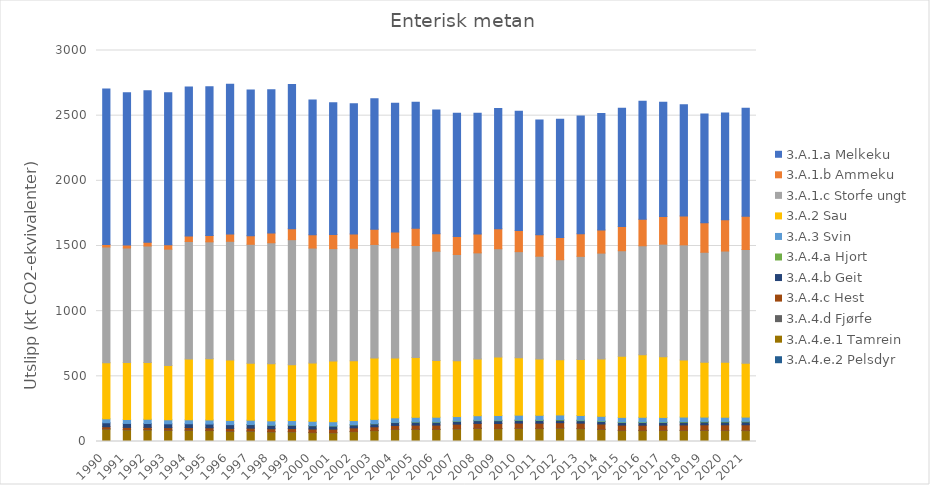
| Category | 3.A.4.e.2 Pelsdyr | 3.A.4.e.1 Tamrein | 3.A.4.d Fjørfe | 3.A.4.c Hest | 3.A.4.b Geit | 3.A.4.a Hjort | 3.A.3 Svin | 3.A.2 Sau | 3.A.1.c Storfe ungt | 3.A.1.b Ammeku | 3.A.1.a Melkeku |
|---|---|---|---|---|---|---|---|---|---|---|---|
| 1990.0 | 0.45 | 95.038 | 1.978 | 15.841 | 30.503 | 0 | 30.082 | 431.003 | 887.637 | 19.729 | 1192.096 |
| 1991.0 | 0.469 | 88.604 | 2.426 | 16.626 | 30.33 | 0 | 30.473 | 437.191 | 878.616 | 22.881 | 1167.5 |
| 1992.0 | 0.361 | 88.409 | 2.4 | 17.31 | 29.822 | 0 | 32.321 | 435.364 | 894.265 | 28.773 | 1163.016 |
| 1993.0 | 0.404 | 85.413 | 2.352 | 18.115 | 29.47 | 0 | 31.041 | 416.771 | 892.356 | 33.322 | 1166.887 |
| 1994.0 | 0.458 | 85.404 | 2.352 | 18.836 | 29.187 | 0 | 30.507 | 465.481 | 902.55 | 41.733 | 1143.943 |
| 1995.0 | 0.466 | 83.235 | 2.304 | 19.159 | 28.651 | 0 | 31.679 | 469.353 | 897.144 | 48.964 | 1140.341 |
| 1996.0 | 0.526 | 78.251 | 2.201 | 19.849 | 28.509 | 0 | 32.794 | 462.471 | 911.447 | 55.832 | 1148.682 |
| 1997.0 | 0.499 | 78.987 | 2.062 | 20.77 | 27.551 | 0.445 | 33.385 | 436.467 | 912.938 | 66.09 | 1117.221 |
| 1998.0 | 0.412 | 73.475 | 2.078 | 22.264 | 26.748 | 0.441 | 33.341 | 438.698 | 927.279 | 74.381 | 1098.84 |
| 1999.0 | 0.361 | 73.683 | 1.995 | 23.437 | 26.096 | 0.974 | 34.179 | 428.637 | 959.207 | 83.909 | 1106.189 |
| 2000.0 | 0.433 | 67.584 | 2.042 | 25.783 | 25.374 | 1.277 | 32.712 | 446.315 | 882.618 | 101.916 | 1033.829 |
| 2001.0 | 0.439 | 65.969 | 1.921 | 26.712 | 24.199 | 1.041 | 31.783 | 465.553 | 862.223 | 109.123 | 1010.891 |
| 2002.0 | 0.432 | 75.2 | 1.989 | 26.828 | 23.308 | 1.523 | 31.246 | 458.675 | 863.272 | 110.361 | 998.071 |
| 2003.0 | 0.421 | 82.349 | 2.042 | 27.881 | 23.101 | 1.357 | 32.521 | 470.878 | 871.366 | 117.335 | 1000.429 |
| 2004.0 | 0.457 | 91.272 | 2.243 | 29.08 | 22.385 | 1.522 | 34.796 | 458.392 | 845.149 | 121.857 | 987.29 |
| 2005.0 | 0.49 | 91.966 | 2.199 | 31.139 | 22.763 | 2.337 | 34.775 | 458.339 | 859.631 | 132.057 | 966.431 |
| 2006.0 | 0.54 | 91.399 | 2.136 | 31.953 | 21.573 | 2.902 | 35.844 | 434.779 | 838.981 | 134.14 | 948.4 |
| 2007.0 | 0.532 | 95.354 | 2.287 | 34.933 | 21.761 | 2.705 | 34.003 | 427.614 | 815.373 | 138.722 | 945.749 |
| 2008.0 | 0.49 | 99.459 | 2.377 | 36.529 | 21.438 | 3.286 | 34.403 | 434.901 | 814.401 | 145.446 | 926.242 |
| 2009.0 | 0.435 | 97.421 | 2.588 | 37.852 | 21.62 | 3.828 | 35.623 | 448.495 | 830.952 | 153.638 | 922.425 |
| 2010.0 | 0.44 | 99.719 | 2.513 | 38.683 | 20.566 | 4.059 | 36.164 | 440.908 | 813.672 | 161.601 | 914.631 |
| 2011.0 | 0.473 | 98.42 | 2.44 | 39.363 | 20.373 | 4.372 | 35.7 | 431.122 | 789.58 | 165.042 | 879.351 |
| 2012.0 | 0.539 | 101.277 | 2.527 | 39.859 | 19.672 | 4.686 | 35.174 | 423.777 | 767.255 | 169.605 | 907.856 |
| 2013.0 | 0.656 | 97.304 | 2.684 | 40.302 | 19.081 | 4.384 | 35.298 | 429.972 | 790.91 | 172.976 | 903.765 |
| 2014.0 | 0.627 | 91.299 | 2.718 | 39.632 | 19.369 | 4.32 | 35.458 | 440.005 | 812.153 | 177.937 | 893.017 |
| 2015.0 | 0.566 | 83.094 | 2.742 | 39.465 | 20.209 | 4.183 | 34.859 | 468.03 | 810.459 | 186.398 | 906.932 |
| 2016.0 | 0.49 | 82.973 | 2.717 | 38.984 | 20.696 | 4.389 | 35.572 | 479.028 | 836.947 | 203.168 | 905.726 |
| 2017.0 | 0.359 | 83.854 | 2.734 | 38.562 | 20.107 | 3.968 | 35.176 | 465.962 | 863.578 | 212.703 | 875.843 |
| 2018.0 | 0.461 | 83.501 | 2.651 | 40.557 | 21.111 | 4.463 | 34.928 | 437.721 | 883.268 | 222.268 | 853.181 |
| 2019.0 | 0.301 | 84.336 | 2.805 | 40.783 | 21.481 | 4.52 | 33.139 | 420.279 | 844.276 | 226.354 | 833.576 |
| 2020.0 | 0.174 | 83.791 | 2.742 | 41.266 | 21.56 | 4.674 | 32.08 | 421.364 | 853.603 | 240.193 | 819.262 |
| 2021.0 | 0.026 | 83.443 | 2.785 | 42.117 | 22.112 | 4.649 | 32.237 | 413.152 | 872.542 | 255.445 | 828.727 |